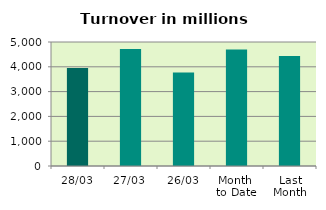
| Category | Series 0 |
|---|---|
| 28/03 | 3954.55 |
| 27/03 | 4718.352 |
| 26/03 | 3768.26 |
| Month 
to Date | 4694.459 |
| Last
Month | 4438.793 |